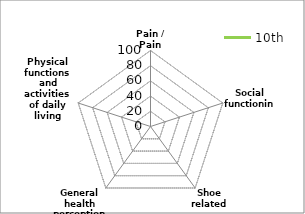
| Category | 10th |
|---|---|
| Pain / Pain related | 0 |
| Social functioning | 0 |
| Shoe related | 0 |
| General health perceptions | 0 |
| Physical functions and activities of daily living (ADL) | 0 |